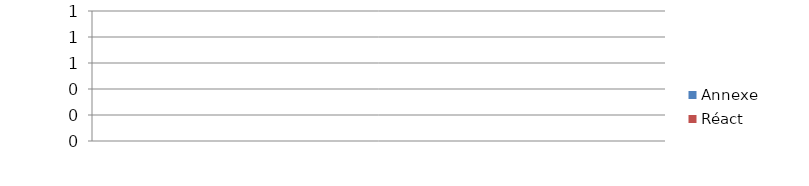
| Category | Annexe | Réact |
|---|---|---|
| 0 | 0 | 0 |
| 1 | 0 | 0 |
| 2 | 0 | 0 |
| 3 | 0 | 0 |
| 4 | 0 | 0 |
| 5 | 0 | 0 |
| 6 | 0 | 0 |
| 7 | 0 | 0 |
| 8 | 0 | 0 |
| 9 | 0 | 0 |